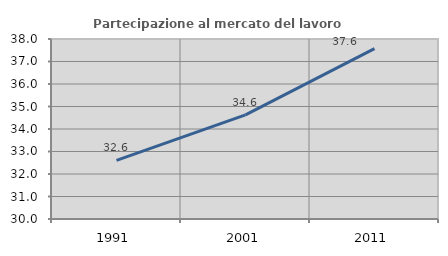
| Category | Partecipazione al mercato del lavoro  femminile |
|---|---|
| 1991.0 | 32.609 |
| 2001.0 | 34.625 |
| 2011.0 | 37.572 |